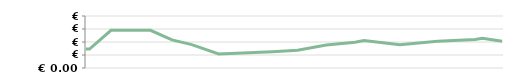
| Category | MESE   |
|---|---|
| 2013-04-23 | 14600 |
| 2013-04-25 | 14600 |
| 2013-05-07 | 29000 |
| 2013-05-14 | 29000 |
| 2013-05-14 | 29000 |
| 2013-05-29 | 29000 |
| 2013-06-10 | 21600 |
| 2013-06-21 | 17950 |
| 2013-07-06 | 10776.471 |
| 2013-08-05 | 12455.862 |
| 2013-08-19 | 13667.568 |
| 2013-09-04 | 17651.667 |
| 2013-09-20 | 19877.912 |
| 2013-09-25 | 21138.05 |
| 2013-10-15 | 17951.744 |
| 2013-11-05 | 20556.13 |
| 2013-11-26 | 21997.139 |
| 2013-11-30 | 22917.635 |
| 2013-12-11 | 20504.315 |